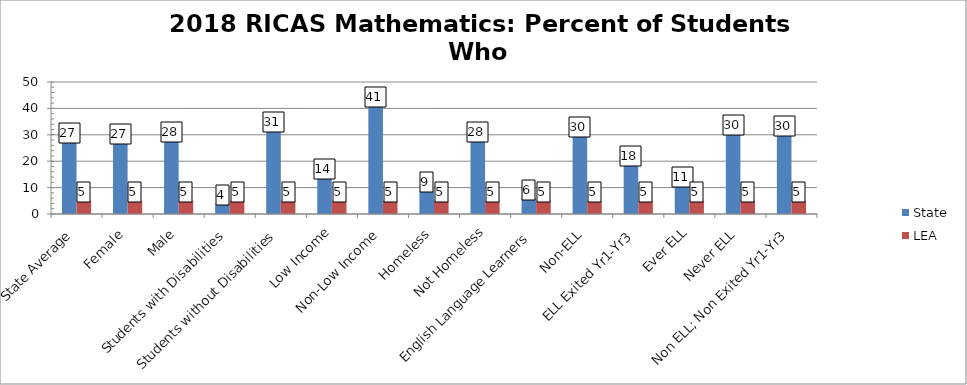
| Category | State | LEA |
|---|---|---|
| State Average | 27.3 | 5 |
| Female | 26.8 | 5 |
| Male | 27.8 | 5 |
| Students with Disabilities | 3.9 | 5 |
| Students without Disabilities | 31.3 | 5 |
| Low Income | 13.5 | 5 |
| Non-Low Income | 40.8 | 5 |
| Homeless | 8.6 | 5 |
| Not Homeless | 27.5 | 5 |
| English Language Learners | 5.8 | 5 |
| Non-ELL | 29.5 | 5 |
| ELL Exited Yr1-Yr3 | 18.4 | 5 |
| Ever ELL | 10.7 | 5 |
| Never ELL | 30.3 | 5 |
| Non ELL; Non Exited Yr1-Yr3 | 30 | 5 |